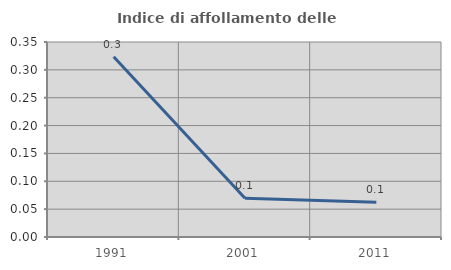
| Category | Indice di affollamento delle abitazioni  |
|---|---|
| 1991.0 | 0.324 |
| 2001.0 | 0.069 |
| 2011.0 | 0.063 |